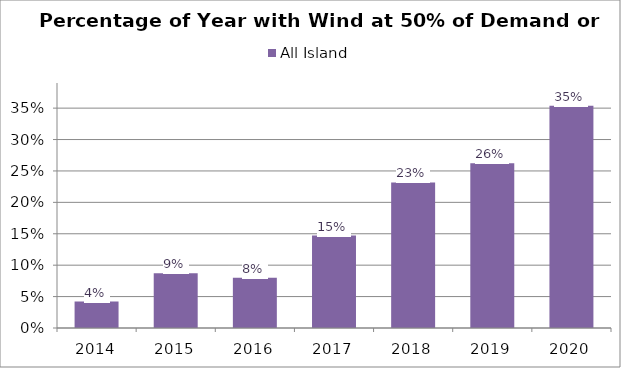
| Category | All Island |
|---|---|
| 2014.0 | 0.042 |
| 2015.0 | 0.087 |
| 2016.0 | 0.08 |
| 2017.0 | 0.147 |
| 2018.0 | 0.232 |
| 2019.0 | 0.262 |
| 2020.0 | 0.354 |